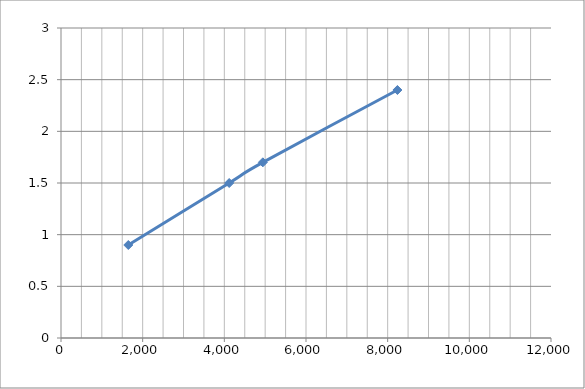
| Category | Series 0 |
|---|---|
| 1647.7199999999998 | 0.9 |
| 4119.299999999999 | 1.5 |
| 4943.16 | 1.7 |
| 8238.599999999999 | 2.4 |